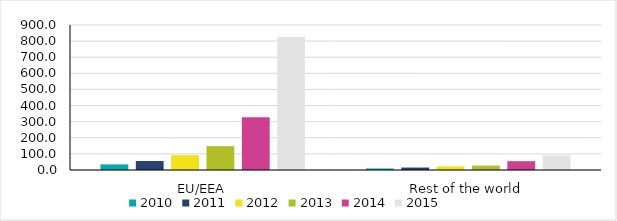
| Category | 2010 | 2011 | 2012 | 2013 | 2014 | 2015 |
|---|---|---|---|---|---|---|
| EU/EEA | 34.839 | 55.762 | 91.878 | 148.087 | 326.775 | 826.153 |
| Rest of the world | 9.567 | 15.2 | 22.111 | 27.331 | 54.737 | 91.299 |